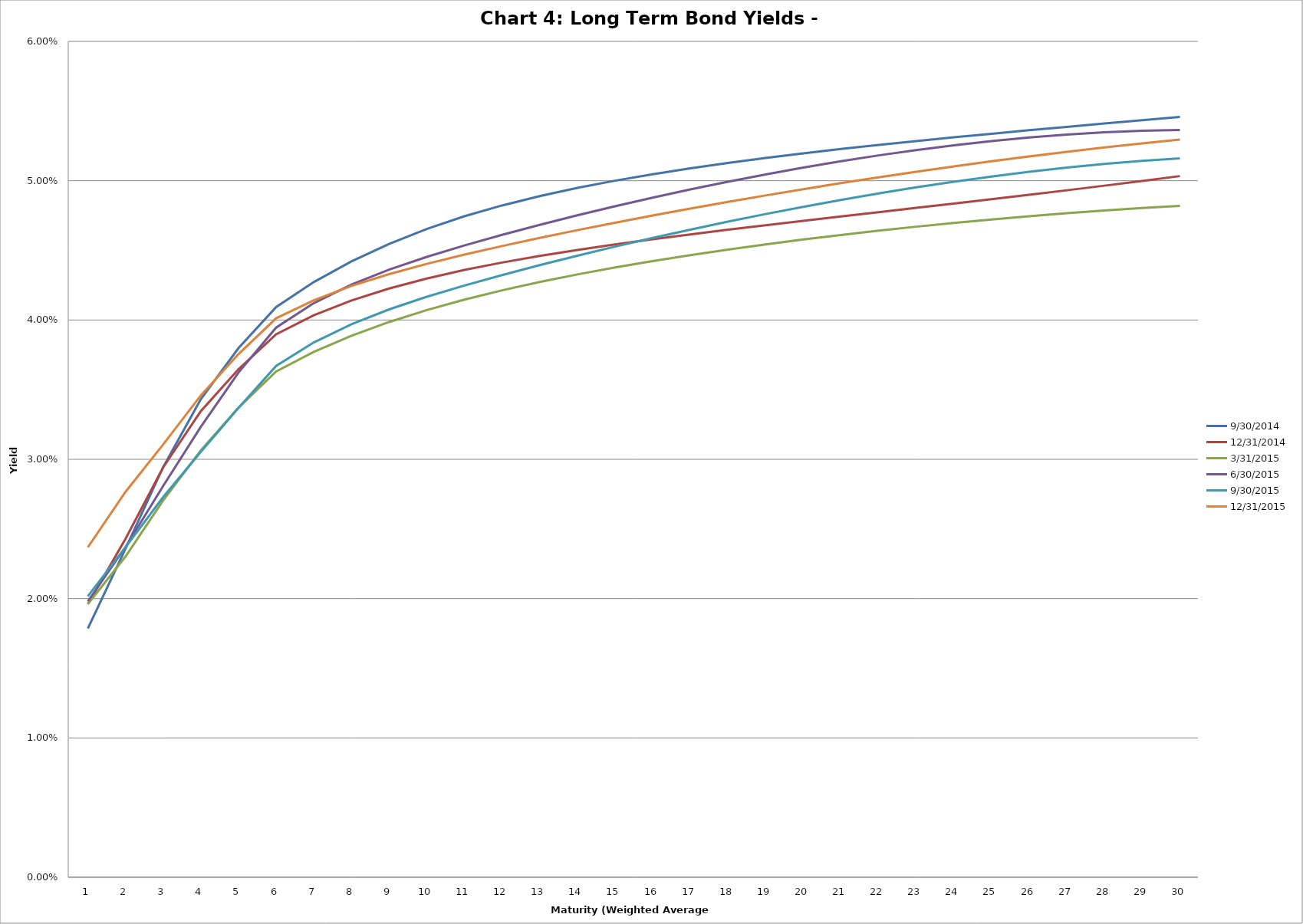
| Category | 9/30/2014 | 12/31/2014 | 3/31/2015 | 6/30/2015 | 9/30/2015 | 12/31/2015 |
|---|---|---|---|---|---|---|
| 0 | 0.018 | 0.02 | 0.02 | 0.02 | 0.02 | 0.024 |
| 1 | 0.024 | 0.024 | 0.023 | 0.024 | 0.024 | 0.028 |
| 2 | 0.029 | 0.029 | 0.027 | 0.028 | 0.027 | 0.031 |
| 3 | 0.034 | 0.033 | 0.031 | 0.032 | 0.031 | 0.035 |
| 4 | 0.038 | 0.036 | 0.034 | 0.036 | 0.034 | 0.038 |
| 5 | 0.041 | 0.039 | 0.036 | 0.039 | 0.037 | 0.04 |
| 6 | 0.043 | 0.04 | 0.038 | 0.041 | 0.038 | 0.041 |
| 7 | 0.044 | 0.041 | 0.039 | 0.043 | 0.04 | 0.042 |
| 8 | 0.045 | 0.042 | 0.04 | 0.044 | 0.041 | 0.043 |
| 9 | 0.047 | 0.043 | 0.041 | 0.045 | 0.042 | 0.044 |
| 10 | 0.047 | 0.044 | 0.041 | 0.045 | 0.042 | 0.045 |
| 11 | 0.048 | 0.044 | 0.042 | 0.046 | 0.043 | 0.045 |
| 12 | 0.049 | 0.045 | 0.043 | 0.047 | 0.044 | 0.046 |
| 13 | 0.049 | 0.045 | 0.043 | 0.048 | 0.045 | 0.046 |
| 14 | 0.05 | 0.045 | 0.044 | 0.048 | 0.045 | 0.047 |
| 15 | 0.05 | 0.046 | 0.044 | 0.049 | 0.046 | 0.048 |
| 16 | 0.051 | 0.046 | 0.045 | 0.049 | 0.046 | 0.048 |
| 17 | 0.051 | 0.046 | 0.045 | 0.05 | 0.047 | 0.048 |
| 18 | 0.052 | 0.047 | 0.045 | 0.05 | 0.048 | 0.049 |
| 19 | 0.052 | 0.047 | 0.046 | 0.051 | 0.048 | 0.049 |
| 20 | 0.052 | 0.047 | 0.046 | 0.051 | 0.049 | 0.05 |
| 21 | 0.053 | 0.048 | 0.046 | 0.052 | 0.049 | 0.05 |
| 22 | 0.053 | 0.048 | 0.047 | 0.052 | 0.05 | 0.051 |
| 23 | 0.053 | 0.048 | 0.047 | 0.053 | 0.05 | 0.051 |
| 24 | 0.053 | 0.049 | 0.047 | 0.053 | 0.05 | 0.051 |
| 25 | 0.054 | 0.049 | 0.047 | 0.053 | 0.051 | 0.052 |
| 26 | 0.054 | 0.049 | 0.048 | 0.053 | 0.051 | 0.052 |
| 27 | 0.054 | 0.05 | 0.048 | 0.053 | 0.051 | 0.052 |
| 28 | 0.054 | 0.05 | 0.048 | 0.054 | 0.051 | 0.053 |
| 29 | 0.055 | 0.05 | 0.048 | 0.054 | 0.052 | 0.053 |